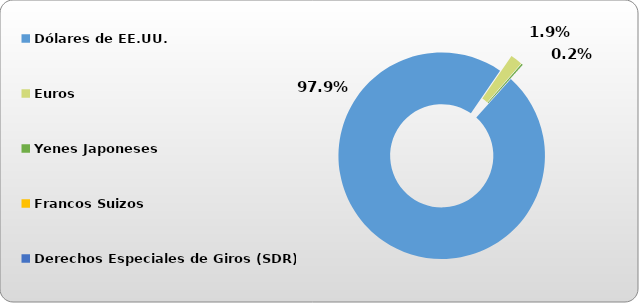
| Category | Dólares de EE.UU. |
|---|---|
| Dólares de EE.UU. | 45458.816 |
| Euros | 871.508 |
| Yenes Japoneses | 106.947 |
| Francos Suizos | 0 |
| Derechos Especiales de Giros (SDR) | 2.77 |